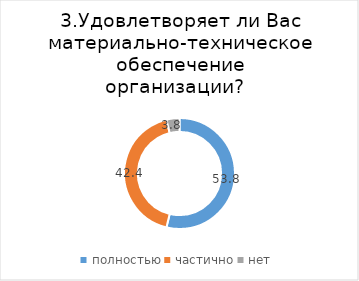
| Category | Series 0 |
|---|---|
| полностью | 53.788 |
| частично | 42.424 |
| нет | 3.788 |